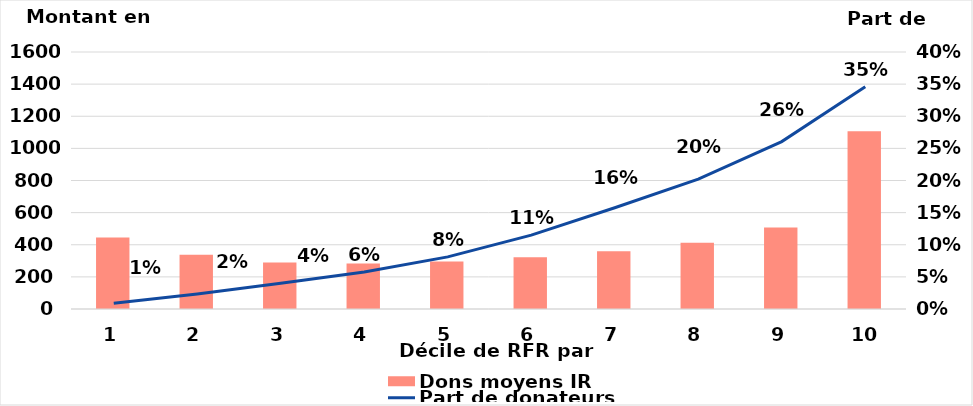
| Category | Dons moyens IR |
|---|---|
| 1.0 | 445 |
| 2.0 | 337 |
| 3.0 | 289 |
| 4.0 | 283 |
| 5.0 | 296 |
| 6.0 | 322 |
| 7.0 | 359 |
| 8.0 | 413 |
| 9.0 | 507 |
| 10.0 | 1107 |